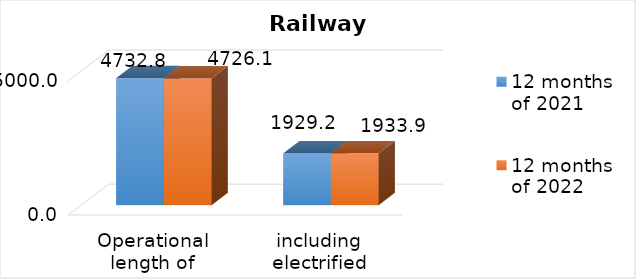
| Category | 12 months of 2021 | 12 months of 2022 |
|---|---|---|
| Operational length of railways, km | 4732.8 | 4726.1 |
| including electrified roads, km | 1929.2 | 1933.9 |